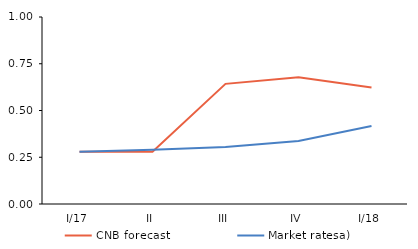
| Category | CNB forecast | Market ratesa) |
|---|---|---|
| I/17 | 0.28 | 0.28 |
| II | 0.28 | 0.29 |
| III | 0.643 | 0.305 |
| IV | 0.677 | 0.338 |
| I/18 | 0.623 | 0.418 |